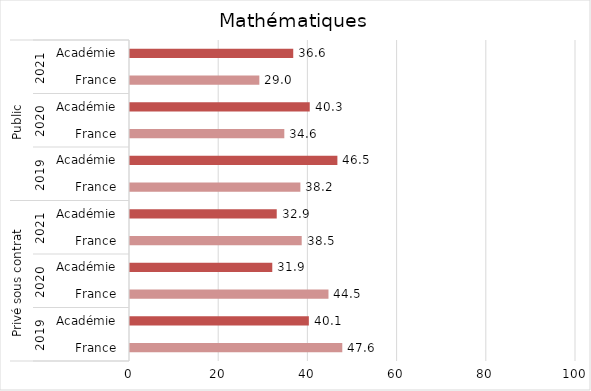
| Category | Mathématiques |
|---|---|
| 0 | 47.6 |
| 1 | 40.1 |
| 2 | 44.5 |
| 3 | 31.9 |
| 4 | 38.5 |
| 5 | 32.9 |
| 6 | 38.2 |
| 7 | 46.5 |
| 8 | 34.6 |
| 9 | 40.3 |
| 10 | 29 |
| 11 | 36.6 |